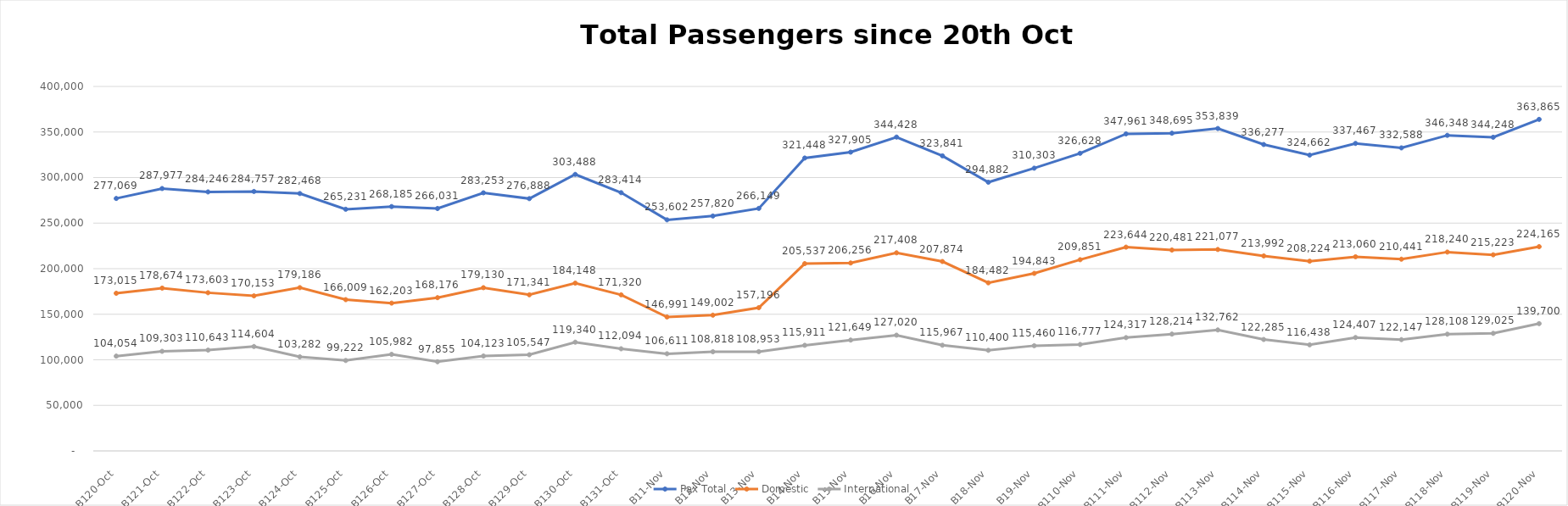
| Category | Pax Total |  Domestic  |  International  |
|---|---|---|---|
| 2022-10-20 | 277069 | 173015 | 104054 |
| 2022-10-21 | 287977 | 178674 | 109303 |
| 2022-10-22 | 284246 | 173603 | 110643 |
| 2022-10-23 | 284757 | 170153 | 114604 |
| 2022-10-24 | 282468 | 179186 | 103282 |
| 2022-10-25 | 265231 | 166009 | 99222 |
| 2022-10-26 | 268185 | 162203 | 105982 |
| 2022-10-27 | 266031 | 168176 | 97855 |
| 2022-10-28 | 283253 | 179130 | 104123 |
| 2022-10-29 | 276888 | 171341 | 105547 |
| 2022-10-30 | 303488 | 184148 | 119340 |
| 2022-10-31 | 283414 | 171320 | 112094 |
| 2022-11-01 | 253602 | 146991 | 106611 |
| 2022-11-02 | 257820 | 149002 | 108818 |
| 2022-11-03 | 266149 | 157196 | 108953 |
| 2022-11-04 | 321448 | 205537 | 115911 |
| 2022-11-05 | 327905 | 206256 | 121649 |
| 2022-11-06 | 344428 | 217408 | 127020 |
| 2022-11-07 | 323841 | 207874 | 115967 |
| 2022-11-08 | 294882 | 184482 | 110400 |
| 2022-11-09 | 310303 | 194843 | 115460 |
| 2022-11-10 | 326628 | 209851 | 116777 |
| 2022-11-11 | 347961 | 223644 | 124317 |
| 2022-11-12 | 348695 | 220481 | 128214 |
| 2022-11-13 | 353839 | 221077 | 132762 |
| 2022-11-14 | 336277 | 213992 | 122285 |
| 2022-11-15 | 324662 | 208224 | 116438 |
| 2022-11-16 | 337467 | 213060 | 124407 |
| 2022-11-17 | 332588 | 210441 | 122147 |
| 2022-11-18 | 346348 | 218240 | 128108 |
| 2022-11-19 | 344248 | 215223 | 129025 |
| 2022-11-20 | 363865 | 224165 | 139700 |